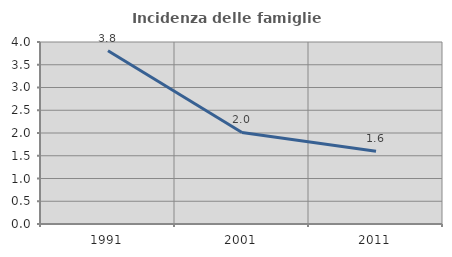
| Category | Incidenza delle famiglie numerose |
|---|---|
| 1991.0 | 3.808 |
| 2001.0 | 2.012 |
| 2011.0 | 1.599 |